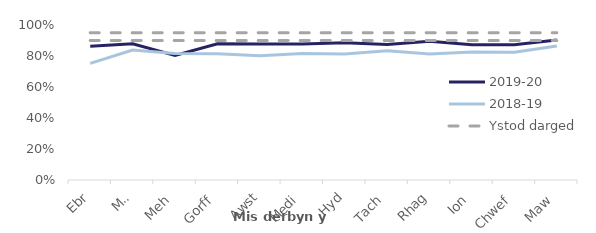
| Category | 2019-20 | 2018-19 | Ystod darged | Affin uchaf |
|---|---|---|---|---|
| Ebr | 0.863 | 0.752 | 0.9 | 0.95 |
| Mai | 0.879 | 0.839 | 0.9 | 0.95 |
| Meh | 0.803 | 0.815 | 0.9 | 0.95 |
| Gorff | 0.879 | 0.814 | 0.9 | 0.95 |
| Awst | 0.878 | 0.801 | 0.9 | 0.95 |
| Medi | 0.877 | 0.816 | 0.9 | 0.95 |
| Hyd | 0.885 | 0.813 | 0.9 | 0.95 |
| Tach | 0.875 | 0.834 | 0.9 | 0.95 |
| Rhag | 0.895 | 0.813 | 0.9 | 0.95 |
| Ion | 0.873 | 0.826 | 0.9 | 0.95 |
| Chwef | 0.872 | 0.824 | 0.9 | 0.95 |
| Maw | 0.903 | 0.864 | 0.9 | 0.95 |